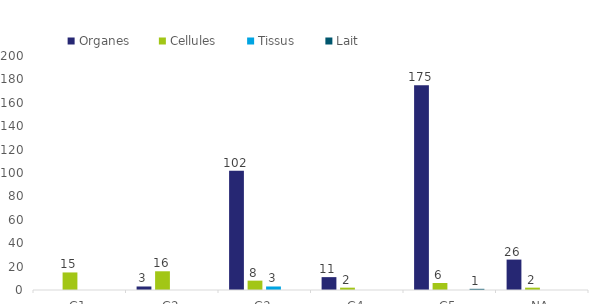
| Category | Organes | Cellules | Tissus | Lait |
|---|---|---|---|---|
| G1 | 0 | 15 | 0 | 0 |
| G2 | 3 | 16 | 0 | 0 |
| G3 | 102 | 8 | 3 | 0 |
| G4 | 11 | 2 | 0 | 0 |
| G5 | 175 | 6 | 0 | 1 |
| NA | 26 | 2 | 0 | 0 |